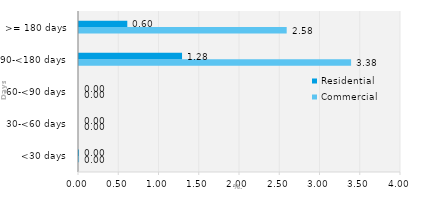
| Category | Commercial | Residential |
|---|---|---|
| <30 days | 0.001 | 0 |
| 30-<60 days | 0 | 0 |
| 60-<90 days | 0 | 0 |
| 90-<180 days | 3.38 | 1.28 |
| >= 180 days | 2.58 | 0.6 |